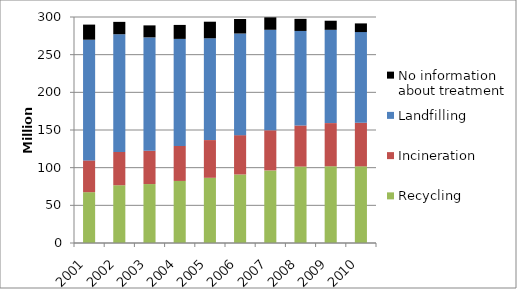
| Category | Recycling | Incineration | Landfilling | No information about treatment |
|---|---|---|---|---|
| 2001 | 67.45 | 42.225 | 160.163 | 20.072 |
| 2002 | 76.677 | 44.163 | 156.271 | 16.43 |
| 2003 | 78.242 | 44.263 | 150.42 | 15.944 |
| 2004 | 82.379 | 46.465 | 142.087 | 18.556 |
| 2005 | 86.563 | 50.048 | 135.146 | 21.995 |
| 2006 | 90.95 | 52.235 | 134.899 | 19.253 |
| 2007 | 96.331 | 53.28 | 133.419 | 16.5 |
| 2008 | 101.459 | 54.561 | 125.468 | 16.064 |
| 2009 | 101.842 | 57.308 | 123.825 | 12.073 |
| 2010 | 101.741 | 57.907 | 120.356 | 11.492 |